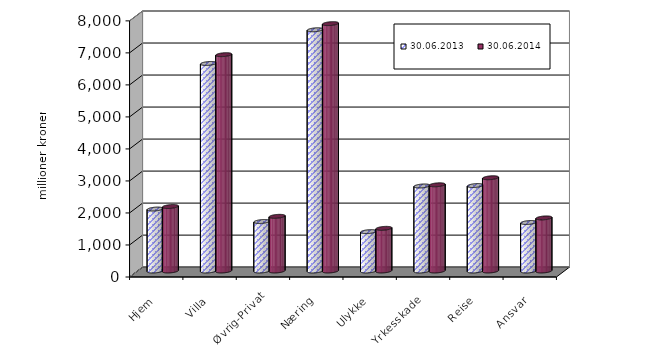
| Category | 30.06.2013 | 30.06.2014 |
|---|---|---|
| Hjem | 1934.88 | 2013.498 |
| Villa | 6482.651 | 6756.81 |
| Øvrig-Privat | 1545.732 | 1707.462 |
| Næring | 7534.692 | 7726.406 |
| Ulykke | 1229.963 | 1332.238 |
| Yrkesskade | 2656.134 | 2692.389 |
| Reise | 2669.038 | 2912.822 |
| Ansvar | 1515.258 | 1657.861 |